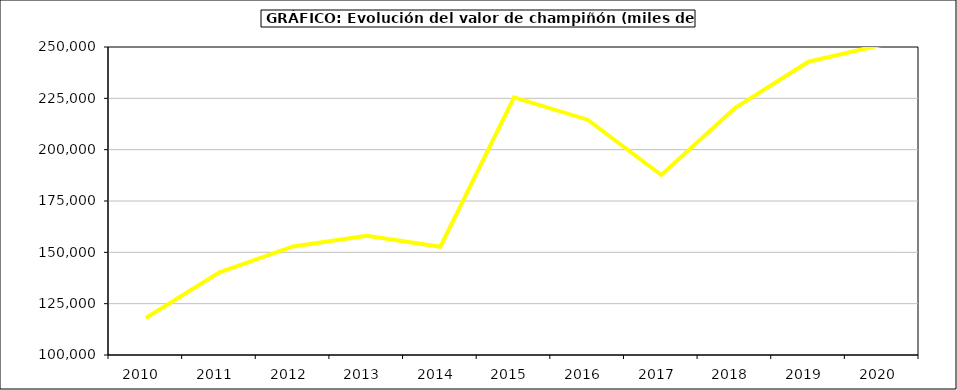
| Category | Valor |
|---|---|
| 2010.0 | 117998.554 |
| 2011.0 | 140234.857 |
| 2012.0 | 152884.195 |
| 2013.0 | 158028.957 |
| 2014.0 | 152745.292 |
| 2015.0 | 225505 |
| 2016.0 | 214600 |
| 2017.0 | 187670.946 |
| 2018.0 | 220250.94 |
| 2019.0 | 242840.888 |
| 2020.0 | 251105.045 |